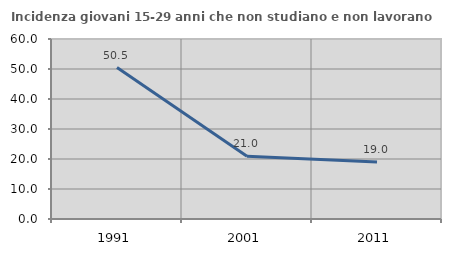
| Category | Incidenza giovani 15-29 anni che non studiano e non lavorano  |
|---|---|
| 1991.0 | 50.485 |
| 2001.0 | 20.952 |
| 2011.0 | 18.987 |